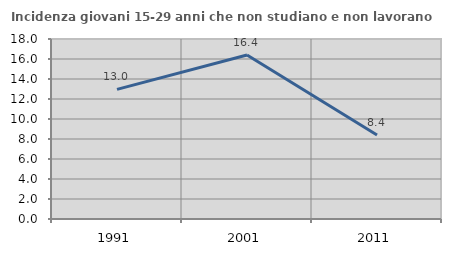
| Category | Incidenza giovani 15-29 anni che non studiano e non lavorano  |
|---|---|
| 1991.0 | 12.965 |
| 2001.0 | 16.393 |
| 2011.0 | 8.403 |